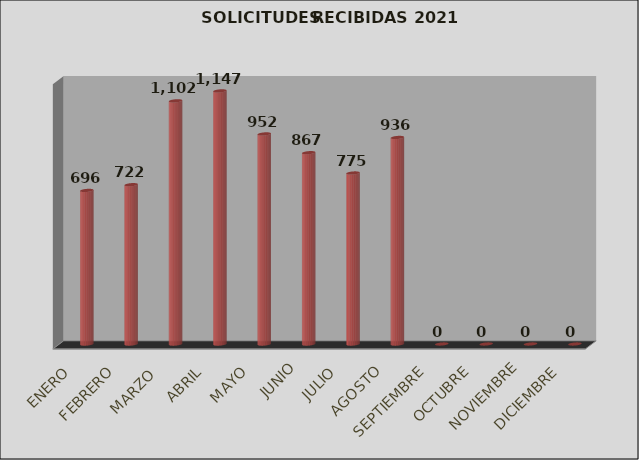
| Category | Series 0 | Series 1 |
|---|---|---|
| ENERO |  | 696 |
| FEBRERO |  | 722 |
| MARZO  |  | 1102 |
| ABRIL |  | 1147 |
| MAYO |  | 952 |
| JUNIO |  | 867 |
| JULIO |  | 775 |
| AGOSTO |  | 936 |
| SEPTIEMBRE |  | 0 |
| OCTUBRE |  | 0 |
| NOVIEMBRE |  | 0 |
| DICIEMBRE |  | 0 |